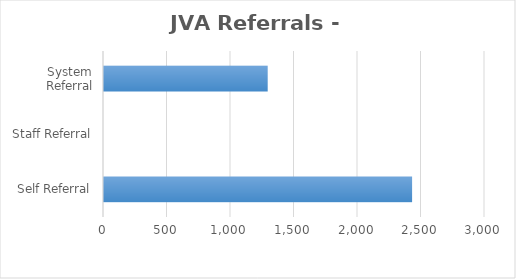
| Category | Series 0 |
|---|---|
| Self Referral | 2426 |
| Staff Referral | 0 |
| System Referral | 1289 |